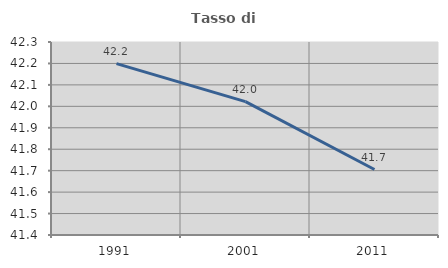
| Category | Tasso di occupazione   |
|---|---|
| 1991.0 | 42.199 |
| 2001.0 | 42.022 |
| 2011.0 | 41.705 |